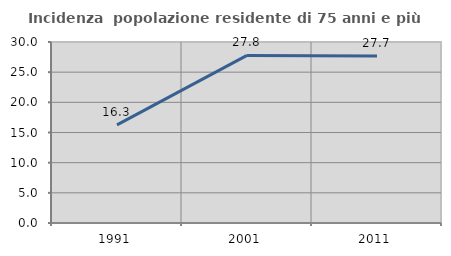
| Category | Incidenza  popolazione residente di 75 anni e più |
|---|---|
| 1991.0 | 16.26 |
| 2001.0 | 27.778 |
| 2011.0 | 27.673 |